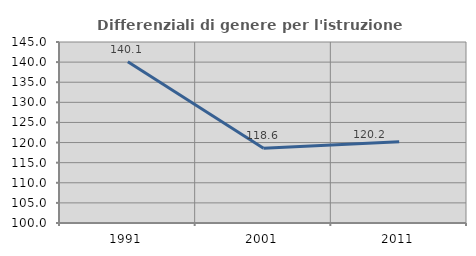
| Category | Differenziali di genere per l'istruzione superiore |
|---|---|
| 1991.0 | 140.07 |
| 2001.0 | 118.603 |
| 2011.0 | 120.203 |